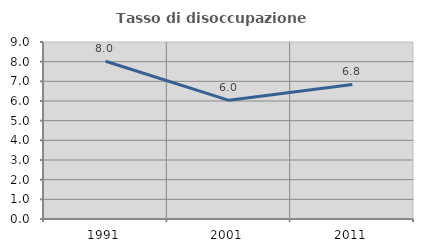
| Category | Tasso di disoccupazione giovanile  |
|---|---|
| 1991.0 | 8.023 |
| 2001.0 | 6.034 |
| 2011.0 | 6.842 |